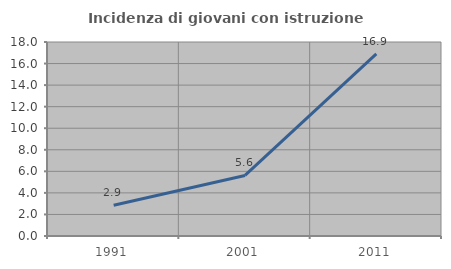
| Category | Incidenza di giovani con istruzione universitaria |
|---|---|
| 1991.0 | 2.857 |
| 2001.0 | 5.618 |
| 2011.0 | 16.901 |